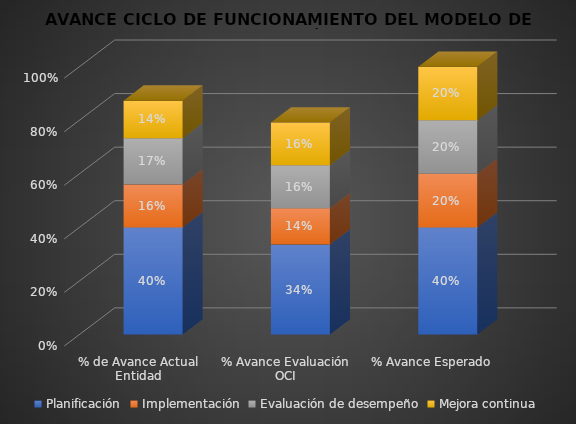
| Category | Planificación | Implementación | Evaluación de desempeño | Mejora continua |
|---|---|---|---|---|
| % de Avance Actual Entidad | 0.4 | 0.16 | 0.173 | 0.14 |
| % Avance Evaluación OCI | 0.336 | 0.136 | 0.16 | 0.16 |
| % Avance Esperado | 0.4 | 0.2 | 0.2 | 0.2 |